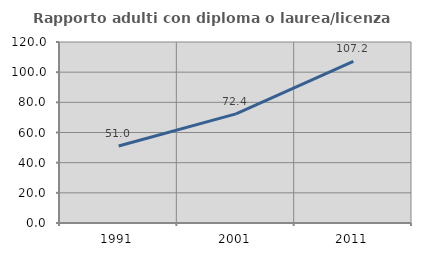
| Category | Rapporto adulti con diploma o laurea/licenza media  |
|---|---|
| 1991.0 | 51.019 |
| 2001.0 | 72.374 |
| 2011.0 | 107.209 |